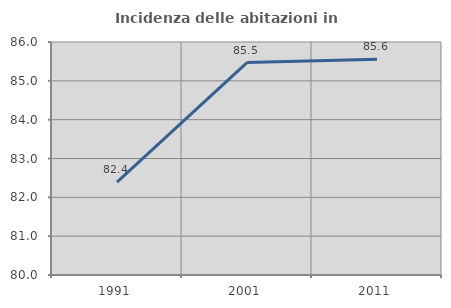
| Category | Incidenza delle abitazioni in proprietà  |
|---|---|
| 1991.0 | 82.391 |
| 2001.0 | 85.469 |
| 2011.0 | 85.558 |